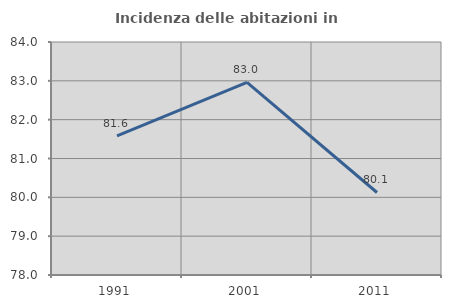
| Category | Incidenza delle abitazioni in proprietà  |
|---|---|
| 1991.0 | 81.582 |
| 2001.0 | 82.963 |
| 2011.0 | 80.125 |